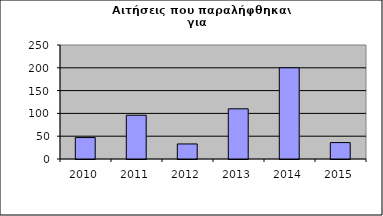
| Category | Series 0 |
|---|---|
| 2010.0 | 47 |
| 2011.0 | 96 |
| 2012.0 | 33 |
| 2013.0 | 110 |
| 2014.0 | 200 |
| 2015.0 | 36 |